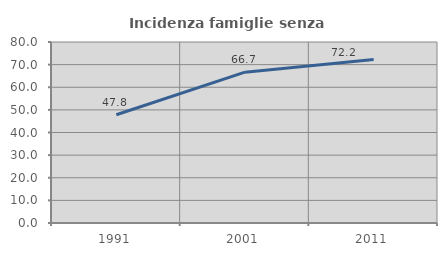
| Category | Incidenza famiglie senza nuclei |
|---|---|
| 1991.0 | 47.826 |
| 2001.0 | 66.667 |
| 2011.0 | 72.222 |